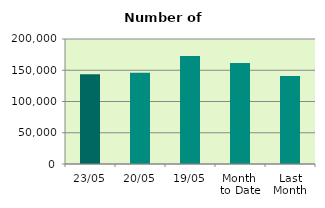
| Category | Series 0 |
|---|---|
| 23/05 | 143404 |
| 20/05 | 146118 |
| 19/05 | 172816 |
| Month 
to Date | 161771 |
| Last
Month | 140978.316 |